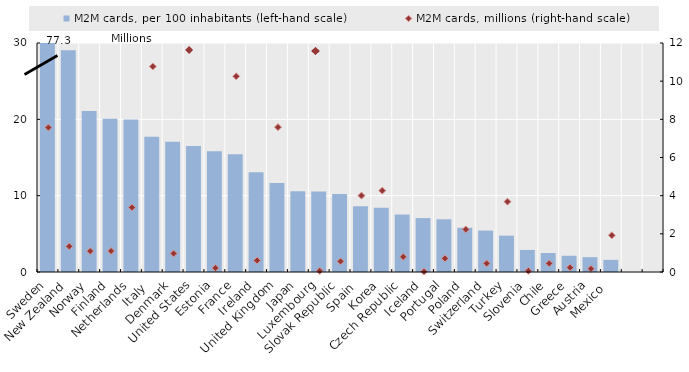
| Category | M2M cards, per 100 inhabitants (left-hand scale) |
|---|---|
| Sweden | 77.251 |
| New Zealand | 29.058 |
| Norway | 21.107 |
| Finland | 20.076 |
| Netherlands | 19.974 |
| Italy  | 17.734 |
| Denmark | 17.074 |
| United States | 16.492 |
| Estonia | 15.807 |
| France | 15.419 |
| Ireland | 13.069 |
| United Kingdom | 11.657 |
| Japan | 10.585 |
| Luxembourg | 10.55 |
| Slovak Republic | 10.231 |
| Spain  | 8.624 |
| Korea | 8.426 |
| Czech Republic | 7.528 |
| Iceland | 7.063 |
| Portugal | 6.9 |
| Poland | 5.796 |
| Switzerland | 5.426 |
| Turkey | 4.759 |
| Slovenia | 2.889 |
| Chile | 2.487 |
| Greece | 2.127 |
| Austria | 1.944 |
| Mexico  | 1.588 |